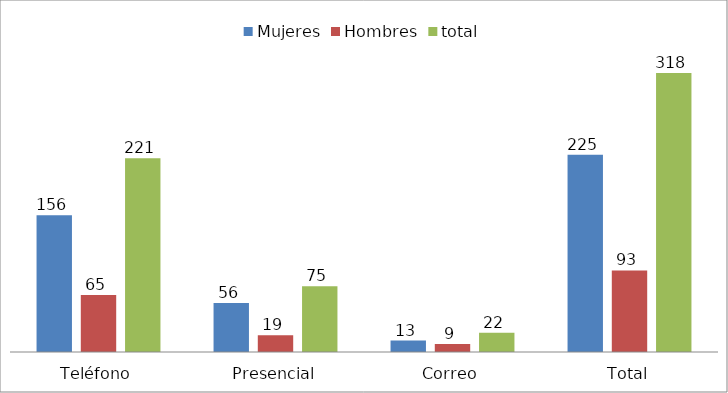
| Category | Mujeres | Hombres | total |
|---|---|---|---|
| Teléfono | 156 | 65 | 221 |
| Presencial | 56 | 19 | 75 |
| Correo | 13 | 9 | 22 |
| Total | 225 | 93 | 318 |